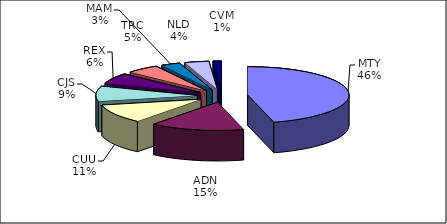
| Category | Series 0 |
|---|---|
| MTY | 63747 |
| ADN | 20829 |
| CUU | 15130 |
| CJS | 12016 |
| REX | 8531 |
| TRC | 7324 |
| MAM | 4288 |
| NLD | 5369 |
| CVM | 1864 |